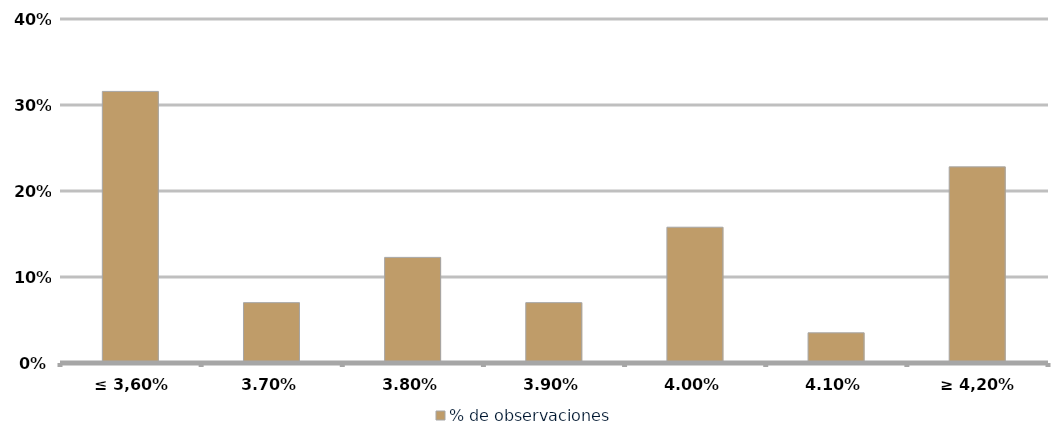
| Category | % de observaciones  |
|---|---|
|  ≤ 3,60%  | 0.316 |
| 3,70% | 0.07 |
| 3,80% | 0.123 |
| 3,90% | 0.07 |
| 4,00% | 0.158 |
| 4,10% | 0.035 |
| ≥ 4,20% | 0.228 |